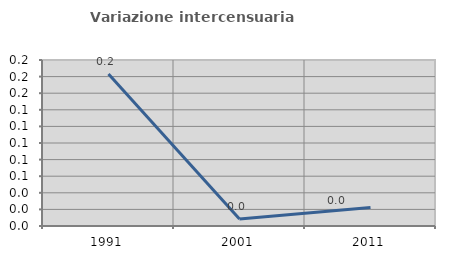
| Category | Variazione intercensuaria annua |
|---|---|
| 1991.0 | 0.183 |
| 2001.0 | 0.008 |
| 2011.0 | 0.022 |